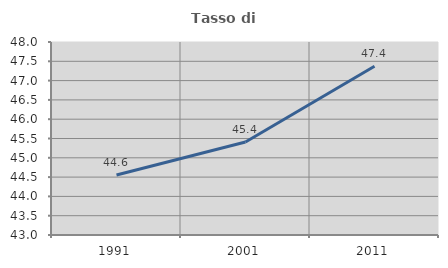
| Category | Tasso di occupazione   |
|---|---|
| 1991.0 | 44.553 |
| 2001.0 | 45.408 |
| 2011.0 | 47.373 |